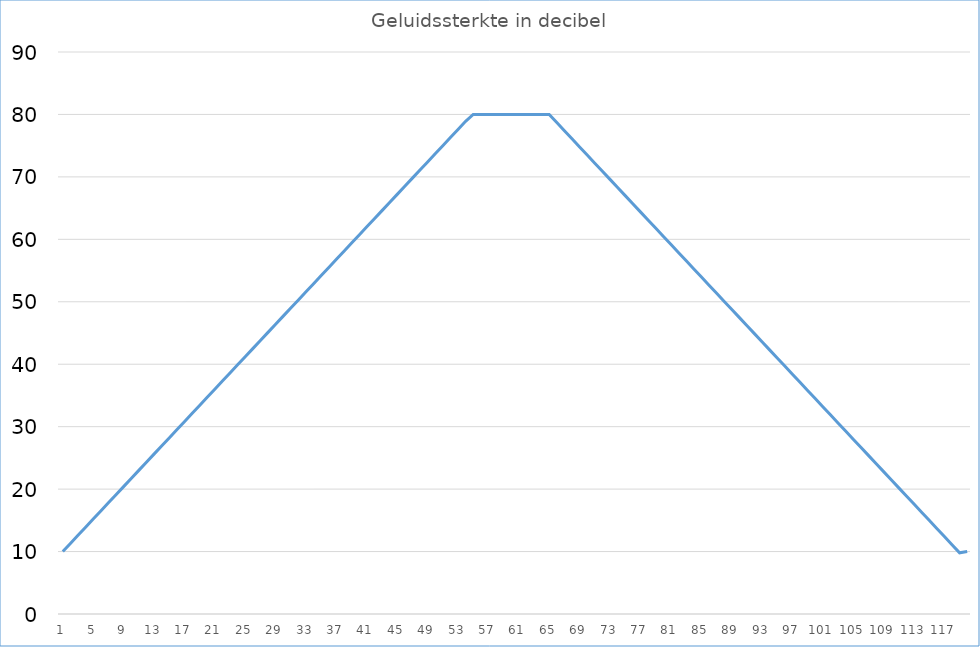
| Category | Series 0 |
|---|---|
| 0 | 10 |
| 1 | 11.3 |
| 2 | 12.6 |
| 3 | 13.9 |
| 4 | 15.2 |
| 5 | 16.5 |
| 6 | 17.8 |
| 7 | 19.1 |
| 8 | 20.4 |
| 9 | 21.7 |
| 10 | 23 |
| 11 | 24.3 |
| 12 | 25.6 |
| 13 | 26.9 |
| 14 | 28.2 |
| 15 | 29.5 |
| 16 | 30.8 |
| 17 | 32.1 |
| 18 | 33.4 |
| 19 | 34.7 |
| 20 | 36 |
| 21 | 37.3 |
| 22 | 38.6 |
| 23 | 39.9 |
| 24 | 41.2 |
| 25 | 42.5 |
| 26 | 43.8 |
| 27 | 45.1 |
| 28 | 46.4 |
| 29 | 47.7 |
| 30 | 49 |
| 31 | 50.3 |
| 32 | 51.6 |
| 33 | 52.9 |
| 34 | 54.2 |
| 35 | 55.5 |
| 36 | 56.8 |
| 37 | 58.1 |
| 38 | 59.4 |
| 39 | 60.7 |
| 40 | 62 |
| 41 | 63.3 |
| 42 | 64.6 |
| 43 | 65.9 |
| 44 | 67.2 |
| 45 | 68.5 |
| 46 | 69.8 |
| 47 | 71.1 |
| 48 | 72.4 |
| 49 | 73.7 |
| 50 | 75 |
| 51 | 76.3 |
| 52 | 77.6 |
| 53 | 78.9 |
| 54 | 80 |
| 55 | 80 |
| 56 | 80 |
| 57 | 80 |
| 58 | 80 |
| 59 | 80 |
| 60 | 80 |
| 61 | 80 |
| 62 | 80 |
| 63 | 80 |
| 64 | 80 |
| 65 | 78.7 |
| 66 | 77.4 |
| 67 | 76.1 |
| 68 | 74.8 |
| 69 | 73.5 |
| 70 | 72.2 |
| 71 | 70.9 |
| 72 | 69.6 |
| 73 | 68.3 |
| 74 | 67 |
| 75 | 65.7 |
| 76 | 64.4 |
| 77 | 63.1 |
| 78 | 61.8 |
| 79 | 60.5 |
| 80 | 59.2 |
| 81 | 57.9 |
| 82 | 56.6 |
| 83 | 55.3 |
| 84 | 54 |
| 85 | 52.7 |
| 86 | 51.4 |
| 87 | 50.1 |
| 88 | 48.8 |
| 89 | 47.5 |
| 90 | 46.2 |
| 91 | 44.9 |
| 92 | 43.6 |
| 93 | 42.3 |
| 94 | 41 |
| 95 | 39.7 |
| 96 | 38.4 |
| 97 | 37.1 |
| 98 | 35.8 |
| 99 | 34.5 |
| 100 | 33.2 |
| 101 | 31.9 |
| 102 | 30.6 |
| 103 | 29.3 |
| 104 | 28 |
| 105 | 26.7 |
| 106 | 25.4 |
| 107 | 24.1 |
| 108 | 22.8 |
| 109 | 21.5 |
| 110 | 20.2 |
| 111 | 18.9 |
| 112 | 17.6 |
| 113 | 16.3 |
| 114 | 15 |
| 115 | 13.7 |
| 116 | 12.4 |
| 117 | 11.1 |
| 118 | 9.8 |
| 119 | 10 |